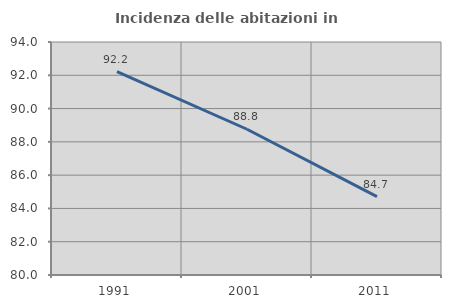
| Category | Incidenza delle abitazioni in proprietà  |
|---|---|
| 1991.0 | 92.216 |
| 2001.0 | 88.757 |
| 2011.0 | 84.706 |